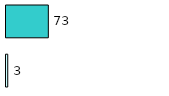
| Category | Series 0 | Series 1 |
|---|---|---|
| 0 | 3 | 73 |